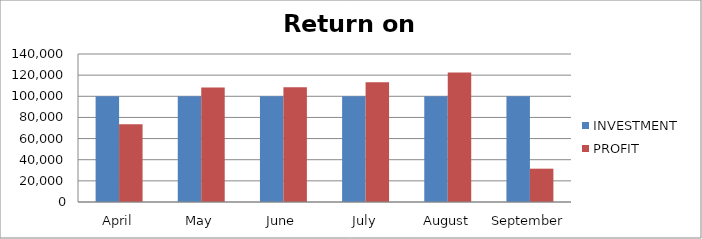
| Category | INVESTMENT  | PROFIT |
|---|---|---|
| April | 100000 | 73460 |
| May | 100000 | 108424 |
| June | 100000 | 108434 |
| July | 100000 | 113164 |
| August | 100000 | 122577 |
| September | 100000 | 31525 |